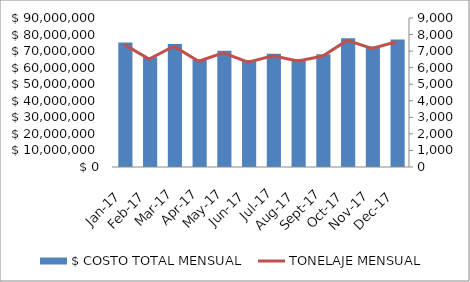
| Category | $ COSTO TOTAL MENSUAL |
|---|---|
| 2017-01-01 | 75242839 |
| 2017-02-01 | 66367059 |
| 2017-03-01 | 74260058 |
| 2017-04-01 | 65012846 |
| 2017-05-01 | 70233145 |
| 2017-06-01 | 64444960 |
| 2017-07-01 | 68446426 |
| 2017-08-01 | 65168686 |
| 2017-09-01 | 68055247 |
| 2017-10-01 | 77811713 |
| 2017-11-01 | 72851793 |
| 2017-12-01 | 76970520 |